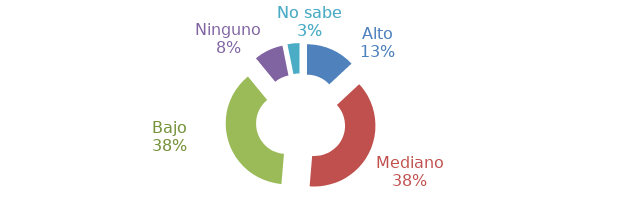
| Category | Series 0 |
|---|---|
| Alto | 0.131 |
| Mediano | 0.383 |
| Bajo | 0.377 |
| Ninguno | 0.078 |
| No sabe | 0.032 |